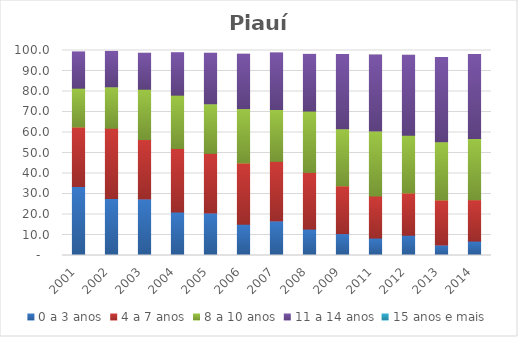
| Category | 0 a 3 anos | 4 a 7 anos | 8 a 10 anos | 11 a 14 anos | 15 anos e mais |
|---|---|---|---|---|---|
| 2001.0 | 33.65 | 29.05 | 18.92 | 17.7 | 0 |
| 2002.0 | 27.77 | 34.31 | 20.2 | 17.27 | 0 |
| 2003.0 | 27.61 | 28.96 | 24.54 | 17.55 | 0 |
| 2004.0 | 21.2 | 31.02 | 25.99 | 20.72 | 0 |
| 2005.0 | 20.76 | 29.06 | 24.18 | 24.66 | 0 |
| 2006.0 | 15.25 | 29.89 | 26.53 | 26.53 | 0 |
| 2007.0 | 16.88 | 29.03 | 25.32 | 27.62 | 0 |
| 2008.0 | 12.88 | 27.66 | 29.91 | 27.66 | 0 |
| 2009.0 | 10.68 | 23.3 | 27.88 | 36.2 | 0 |
| 2011.0 | 8.5 | 20.52 | 31.73 | 37.02 | 0 |
| 2012.0 | 9.88 | 20.65 | 28.17 | 38.94 | 0 |
| 2013.0 | 5.14 | 21.96 | 28.35 | 41.12 | 0 |
| 2014.0 | 7.03 | 20.18 | 29.9 | 40.96 | 0 |